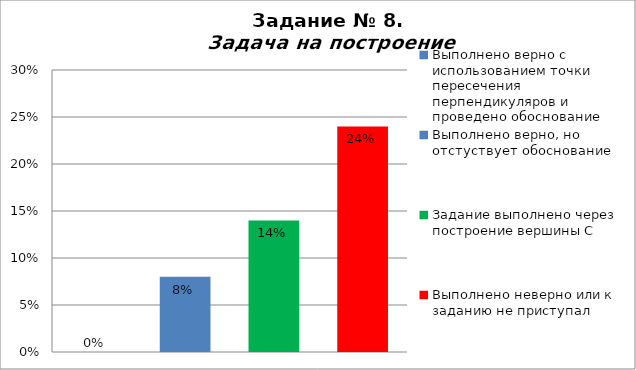
| Category | Задача на построение |
|---|---|
| Выполнено верно с использованием точки пересечения перпендикуляров и проведено обоснование | 0 |
| Выполнено верно, но отстуствует обоснование | 0.08 |
| Задание выполнено через построение вершины С | 0.14 |
| Выполнено неверно или к заданию не приступал | 0.24 |